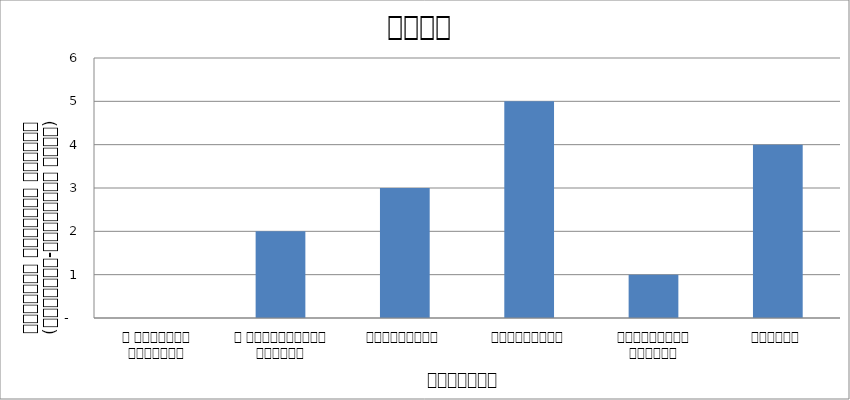
| Category | शासन |
|---|---|
| द हिमालयन टाइम्स् | 0 |
| द काठमाण्डौं पोस्ट् | 2 |
| रिपब्लिका | 3 |
| कान्तिपुर | 5 |
| अन्नपूर्ण पोस्ट् | 1 |
| नागरिक | 4 |